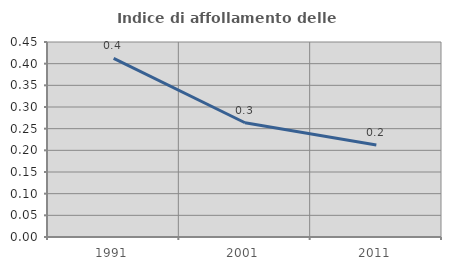
| Category | Indice di affollamento delle abitazioni  |
|---|---|
| 1991.0 | 0.412 |
| 2001.0 | 0.264 |
| 2011.0 | 0.212 |